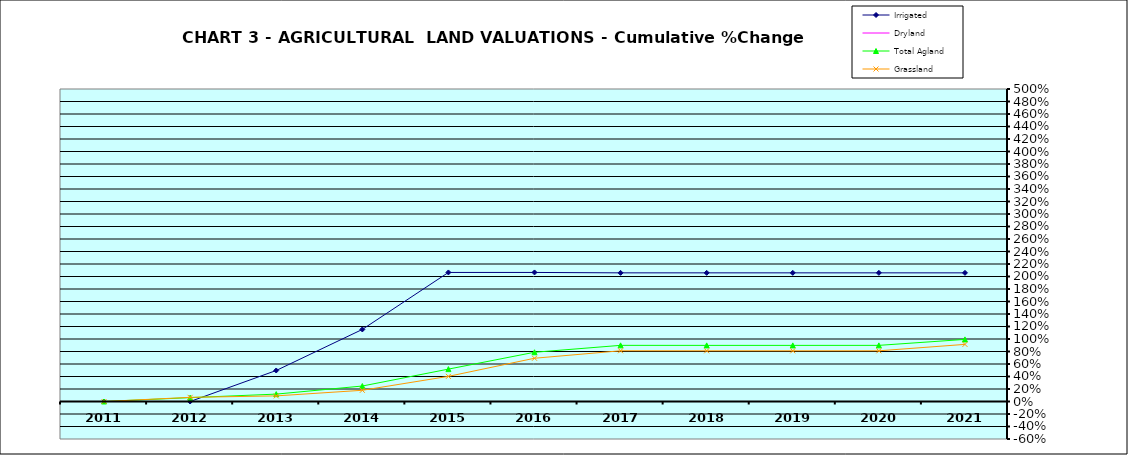
| Category | Irrigated | Dryland | Total Agland | Grassland |
|---|---|---|---|---|
| 2011.0 | 0 | 0 | 0 | 0 |
| 2012.0 | 0 | 0 | 0.062 | 0.067 |
| 2013.0 | 0.496 | 0 | 0.118 | 0.09 |
| 2014.0 | 1.153 | 0 | 0.248 | 0.179 |
| 2015.0 | 2.065 | 0 | 0.518 | 0.402 |
| 2016.0 | 2.065 | 0 | 0.788 | 0.692 |
| 2017.0 | 2.058 | 0 | 0.898 | 0.812 |
| 2018.0 | 2.058 | 0 | 0.898 | 0.811 |
| 2019.0 | 2.058 | 0 | 0.898 | 0.811 |
| 2020.0 | 2.058 | 0 | 0.898 | 0.811 |
| 2021.0 | 2.058 | 0 | 0.994 | 0.914 |